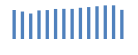
| Category | Exportações (1) |
|---|---|
| 0 | 392293.987 |
| 1 | 370979.678 |
| 2 | 344221.998 |
| 3 | 386156.652 |
| 4 | 390987.572 |
| 5 | 406063.094 |
| 6 | 407598.054 |
| 7 | 406953.169 |
| 8 | 421887.391 |
| 9 | 431264.801 |
| 10 | 442364.452 |
| 11 | 454202.095 |
| 12 | 454929.952 |
| 13 | 393954.142 |